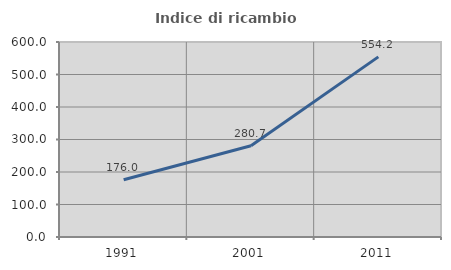
| Category | Indice di ricambio occupazionale  |
|---|---|
| 1991.0 | 175.99 |
| 2001.0 | 280.677 |
| 2011.0 | 554.188 |